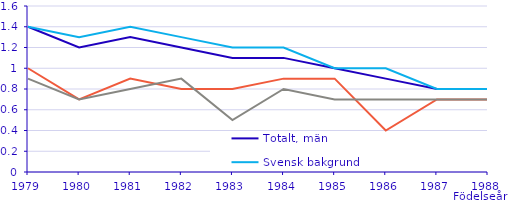
| Category | Totalt, män | Svensk bakgrund | Född i Sverige med två utrikes födda föräldrar | Utrikes född |
|---|---|---|---|---|
| 1979.0 | 1.4 | 1.4 | 1 | 0.9 |
| 1980.0 | 1.2 | 1.3 | 0.7 | 0.7 |
| 1981.0 | 1.3 | 1.4 | 0.9 | 0.8 |
| 1982.0 | 1.2 | 1.3 | 0.8 | 0.9 |
| 1983.0 | 1.1 | 1.2 | 0.8 | 0.5 |
| 1984.0 | 1.1 | 1.2 | 0.9 | 0.8 |
| 1985.0 | 1 | 1 | 0.9 | 0.7 |
| 1986.0 | 0.9 | 1 | 0.4 | 0.7 |
| 1987.0 | 0.8 | 0.8 | 0.7 | 0.7 |
| 1988.0 | 0.8 | 0.8 | 0.7 | 0.7 |